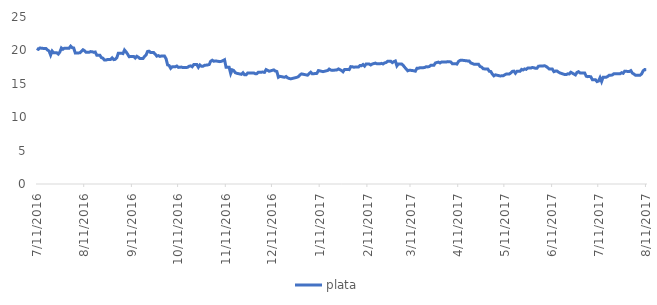
| Category | plata |
|---|---|
| 7/11/16 | 20.29 |
| 7/12/16 | 20.16 |
| 7/13/16 | 20.36 |
| 7/14/16 | 20.33 |
| 7/15/16 | 20.3 |
| 7/17/16 | 20.3 |
| 7/18/16 | 20.05 |
| 7/19/16 | 19.91 |
| 7/20/16 | 19.3 |
| 7/21/16 | 19.9 |
| 7/22/16 | 19.64 |
| 7/24/16 | 19.64 |
| 7/25/16 | 19.45 |
| 7/26/16 | 19.76 |
| 7/27/16 | 20.36 |
| 7/28/16 | 20.17 |
| 7/29/16 | 20.34 |
| 7/31/16 | 20.34 |
| 8/1/16 | 20.32 |
| 8/2/16 | 20.63 |
| 8/3/16 | 20.41 |
| 8/4/16 | 20.36 |
| 8/5/16 | 19.62 |
| 8/7/16 | 19.62 |
| 8/8/16 | 19.64 |
| 8/9/16 | 19.87 |
| 8/10/16 | 20.1 |
| 8/11/16 | 19.96 |
| 8/12/16 | 19.72 |
| 8/14/16 | 19.72 |
| 8/15/16 | 19.82 |
| 8/16/16 | 19.8 |
| 8/17/16 | 19.71 |
| 8/18/16 | 19.76 |
| 8/19/16 | 19.27 |
| 8/21/16 | 19.27 |
| 8/22/16 | 18.92 |
| 8/23/16 | 18.83 |
| 8/24/16 | 18.55 |
| 8/25/16 | 18.55 |
| 8/26/16 | 18.65 |
| 8/28/16 | 18.65 |
| 8/29/16 | 18.88 |
| 8/30/16 | 18.62 |
| 8/31/16 | 18.66 |
| 9/1/16 | 18.89 |
| 9/2/16 | 19.58 |
| 9/4/16 | 19.58 |
| 9/5/16 | 19.52 |
| 9/6/16 | 20.06 |
| 9/7/16 | 19.79 |
| 9/8/16 | 19.45 |
| 9/9/16 | 19.06 |
| 9/12/16 | 19.1 |
| 9/13/16 | 18.86 |
| 9/14/16 | 19.12 |
| 9/15/16 | 18.98 |
| 9/16/16 | 18.78 |
| 9/18/16 | 18.78 |
| 9/19/16 | 19.09 |
| 9/20/16 | 19.3 |
| 9/21/16 | 19.85 |
| 9/22/16 | 19.88 |
| 9/23/16 | 19.67 |
| 9/25/16 | 19.67 |
| 9/26/16 | 19.43 |
| 9/27/16 | 19.14 |
| 9/28/16 | 19.22 |
| 9/29/16 | 19.1 |
| 9/30/16 | 19.16 |
| 10/2/16 | 19.16 |
| 10/3/16 | 18.75 |
| 10/4/16 | 17.83 |
| 10/5/16 | 17.74 |
| 10/6/16 | 17.32 |
| 10/7/16 | 17.55 |
| 10/9/16 | 17.55 |
| 10/10/16 | 17.66 |
| 10/11/16 | 17.46 |
| 10/12/16 | 17.49 |
| 10/13/16 | 17.5 |
| 10/14/16 | 17.43 |
| 10/16/16 | 17.43 |
| 10/17/16 | 17.47 |
| 10/18/16 | 17.63 |
| 10/19/16 | 17.68 |
| 10/20/16 | 17.55 |
| 10/21/16 | 17.88 |
| 10/23/16 | 17.88 |
| 10/24/16 | 17.47 |
| 10/25/16 | 17.82 |
| 10/26/16 | 17.62 |
| 10/27/16 | 17.63 |
| 10/28/16 | 17.77 |
| 10/30/16 | 17.82 |
| 10/31/16 | 17.88 |
| 11/1/16 | 18.37 |
| 11/2/16 | 18.53 |
| 11/3/16 | 18.37 |
| 11/4/16 | 18.43 |
| 11/7/16 | 18.32 |
| 11/8/16 | 18.37 |
| 11/9/16 | 18.48 |
| 11/10/16 | 18.6 |
| 11/11/16 | 17.47 |
| 11/13/16 | 17.47 |
| 11/14/16 | 16.53 |
| 11/15/16 | 17.09 |
| 11/16/16 | 16.98 |
| 11/17/16 | 16.66 |
| 11/18/16 | 16.57 |
| 11/21/16 | 16.42 |
| 11/22/16 | 16.65 |
| 11/23/16 | 16.35 |
| 11/24/16 | 16.34 |
| 11/25/16 | 16.61 |
| 11/27/16 | 16.61 |
| 11/28/16 | 16.61 |
| 11/29/16 | 16.63 |
| 11/30/16 | 16.51 |
| 12/1/16 | 16.52 |
| 12/2/16 | 16.74 |
| 12/5/16 | 16.75 |
| 12/6/16 | 16.71 |
| 12/7/16 | 17.13 |
| 12/8/16 | 17.01 |
| 12/9/16 | 16.88 |
| 12/12/16 | 17.08 |
| 12/13/16 | 16.91 |
| 12/14/16 | 16.84 |
| 12/15/16 | 15.98 |
| 12/16/16 | 16.12 |
| 12/19/16 | 15.97 |
| 12/20/16 | 16.09 |
| 12/21/16 | 15.89 |
| 12/22/16 | 15.8 |
| 12/23/16 | 15.74 |
| 12/27/16 | 15.97 |
| 12/28/16 | 16.08 |
| 12/29/16 | 16.33 |
| 12/30/16 | 16.48 |
| 1/3/17 | 16.29 |
| 1/4/17 | 16.54 |
| 1/5/17 | 16.73 |
| 1/6/17 | 16.49 |
| 1/9/17 | 16.56 |
| 1/10/17 | 16.98 |
| 1/13/17 | 16.82 |
| 1/16/17 | 16.99 |
| 1/17/17 | 17.2 |
| 1/18/17 | 17.06 |
| 1/19/17 | 17.01 |
| 1/22/17 | 17.08 |
| 1/23/17 | 17.23 |
| 1/24/17 | 17.11 |
| 1/25/17 | 16.99 |
| 1/26/17 | 16.8 |
| 1/27/17 | 17.14 |
| 1/29/17 | 17.14 |
| 1/30/17 | 17.12 |
| 1/31/17 | 17.57 |
| 2/1/17 | 17.56 |
| 2/2/17 | 17.48 |
| 2/3/17 | 17.51 |
| 2/5/17 | 17.51 |
| 2/6/17 | 17.74 |
| 2/7/17 | 17.71 |
| 2/8/17 | 17.89 |
| 2/9/17 | 17.65 |
| 2/10/17 | 17.96 |
| 2/12/17 | 17.96 |
| 2/13/17 | 17.82 |
| 2/14/17 | 17.96 |
| 2/16/17 | 18.1 |
| 2/17/17 | 17.99 |
| 2/19/17 | 17.99 |
| 2/20/17 | 18.06 |
| 2/21/17 | 17.97 |
| 2/22/17 | 18.13 |
| 2/23/17 | 18.19 |
| 2/24/17 | 18.38 |
| 2/26/17 | 18.38 |
| 2/27/17 | 18.17 |
| 2/28/17 | 18.31 |
| 3/1/17 | 18.42 |
| 3/2/17 | 17.68 |
| 3/3/17 | 17.98 |
| 3/5/17 | 17.98 |
| 3/6/17 | 17.79 |
| 3/7/17 | 17.49 |
| 3/8/17 | 17.23 |
| 3/9/17 | 16.95 |
| 3/10/17 | 17.04 |
| 3/12/17 | 16.99 |
| 3/13/17 | 16.95 |
| 3/14/17 | 16.89 |
| 3/15/17 | 17.32 |
| 3/16/17 | 17.32 |
| 3/17/17 | 17.41 |
| 3/19/17 | 17.41 |
| 3/20/17 | 17.44 |
| 3/21/17 | 17.56 |
| 3/22/17 | 17.53 |
| 3/23/17 | 17.58 |
| 3/24/17 | 17.76 |
| 3/26/17 | 17.76 |
| 3/27/17 | 18.11 |
| 3/28/17 | 18.19 |
| 3/29/17 | 18.25 |
| 3/30/17 | 18.12 |
| 3/31/17 | 18.26 |
| 4/2/17 | 18.26 |
| 4/3/17 | 18.26 |
| 4/4/17 | 18.32 |
| 4/5/17 | 18.31 |
| 4/6/17 | 18.27 |
| 4/7/17 | 18.01 |
| 4/8/17 | 18.01 |
| 4/9/17 | 18.01 |
| 4/10/17 | 17.95 |
| 4/11/17 | 18.34 |
| 4/12/17 | 18.5 |
| 4/13/17 | 18.54 |
| 4/17/17 | 18.42 |
| 4/18/17 | 18.41 |
| 4/19/17 | 18.12 |
| 4/20/17 | 18.04 |
| 4/21/17 | 17.94 |
| 4/24/17 | 17.94 |
| 4/25/17 | 17.6 |
| 4/26/17 | 17.5 |
| 4/27/17 | 17.26 |
| 4/28/17 | 17.23 |
| 4/30/17 | 17.23 |
| 5/1/17 | 16.88 |
| 5/2/17 | 16.84 |
| 5/3/17 | 16.46 |
| 5/4/17 | 16.19 |
| 5/5/17 | 16.34 |
| 5/8/17 | 16.18 |
| 5/9/17 | 16.19 |
| 5/10/17 | 16.2 |
| 5/11/17 | 16.33 |
| 5/12/17 | 16.46 |
| 5/14/17 | 16.46 |
| 5/15/17 | 16.63 |
| 5/16/17 | 16.86 |
| 5/17/17 | 16.9 |
| 5/18/17 | 16.58 |
| 5/19/17 | 16.87 |
| 5/21/17 | 16.87 |
| 5/22/17 | 17.16 |
| 5/23/17 | 17.07 |
| 5/24/17 | 17.23 |
| 5/25/17 | 17.16 |
| 5/26/17 | 17.35 |
| 5/28/17 | 17.35 |
| 5/29/17 | 17.44 |
| 5/30/17 | 17.4 |
| 5/31/17 | 17.33 |
| 6/1/17 | 17.33 |
| 6/2/17 | 17.64 |
| 6/5/17 | 17.67 |
| 6/6/17 | 17.71 |
| 6/7/17 | 17.59 |
| 6/8/17 | 17.42 |
| 6/9/17 | 17.2 |
| 6/11/17 | 17.2 |
| 6/12/17 | 16.82 |
| 6/13/17 | 16.9 |
| 6/14/17 | 16.91 |
| 6/15/17 | 16.75 |
| 6/16/17 | 16.62 |
| 6/19/17 | 16.39 |
| 6/20/17 | 16.38 |
| 6/21/17 | 16.49 |
| 6/22/17 | 16.48 |
| 6/23/17 | 16.73 |
| 6/26/17 | 16.33 |
| 6/27/17 | 16.7 |
| 6/28/17 | 16.81 |
| 6/29/17 | 16.63 |
| 6/30/17 | 16.61 |
| 7/1/17 | 16.61 |
| 7/2/17 | 16.61 |
| 7/3/17 | 16.14 |
| 7/4/17 | 16.07 |
| 7/5/17 | 16.09 |
| 7/6/17 | 16.05 |
| 7/7/17 | 15.62 |
| 7/9/17 | 15.62 |
| 7/10/17 | 15.33 |
| 7/11/17 | 15.41 |
| 7/12/17 | 15.92 |
| 7/13/17 | 15.34 |
| 7/14/17 | 15.99 |
| 7/16/17 | 15.99 |
| 7/17/17 | 16.11 |
| 7/18/17 | 16.29 |
| 7/19/17 | 16.28 |
| 7/20/17 | 16.33 |
| 7/21/17 | 16.51 |
| 7/24/17 | 16.49 |
| 7/25/17 | 16.5 |
| 7/26/17 | 16.66 |
| 7/27/17 | 16.57 |
| 7/28/17 | 16.89 |
| 7/31/17 | 16.83 |
| 8/1/17 | 16.97 |
| 8/2/17 | 16.59 |
| 8/3/17 | 16.47 |
| 8/4/17 | 16.28 |
| 8/6/17 | 16.28 |
| 8/7/17 | 16.29 |
| 8/8/17 | 16.47 |
| 8/9/17 | 16.95 |
| 8/10/17 | 17.13 |
| 8/11/17 | 17.11 |